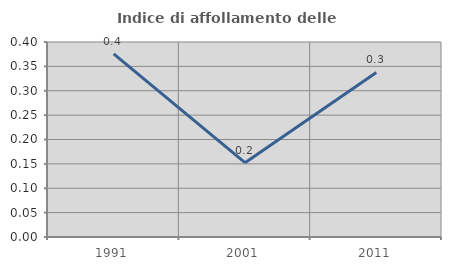
| Category | Indice di affollamento delle abitazioni  |
|---|---|
| 1991.0 | 0.376 |
| 2001.0 | 0.153 |
| 2011.0 | 0.338 |